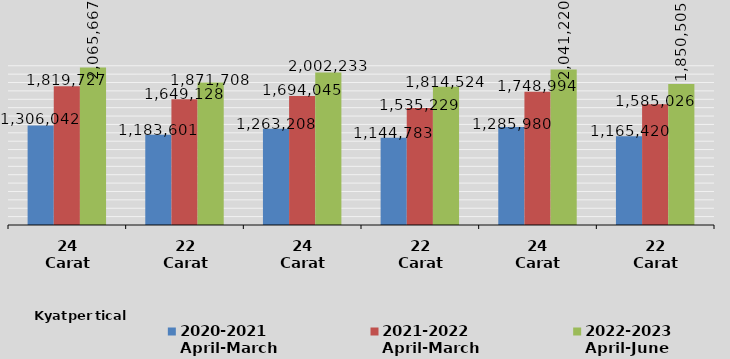
| Category | 2020-2021
April-March
 | 2021-2022
April-March
 | 2022-2023
April-June

 |
|---|---|---|---|
| 24 Carat | 1306041.667 | 1819727.273 | 2065666.667 |
| 22 Carat | 1183601.25 | 1649127.727 | 1871708.333 |
| 24 Carat | 1263208.333 | 1694045.455 | 2002233.333 |
| 22 Carat | 1144783.333 | 1535228.693 | 1814523.958 |
| 24 Carat | 1285980.482 | 1748994.475 | 2041220.076 |
| 22 Carat | 1165420.322 | 1585026.267 | 1850505.173 |